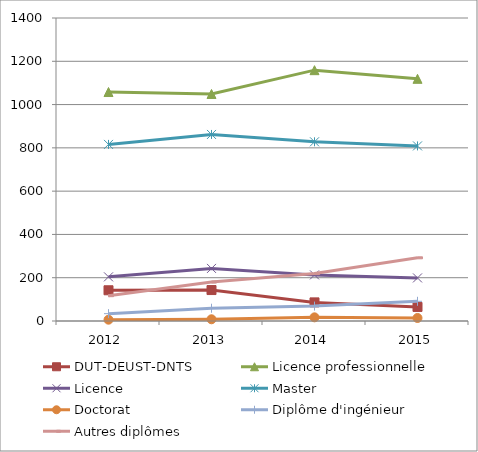
| Category | DUT-DEUST-DNTS | Licence professionnelle | Licence | Master | Doctorat | Diplôme d'ingénieur | Autres diplômes |
|---|---|---|---|---|---|---|---|
| 2012.0 | 142 | 1058 | 204 | 816 | 6 | 34 | 117 |
| 2013.0 | 143 | 1049 | 243 | 862 | 8 | 59 | 180 |
| 2014.0 | 86 | 1159 | 213 | 828 | 17 | 69 | 219 |
| 2015.0 | 65 | 1119 | 199 | 809 | 14 | 91 | 292 |